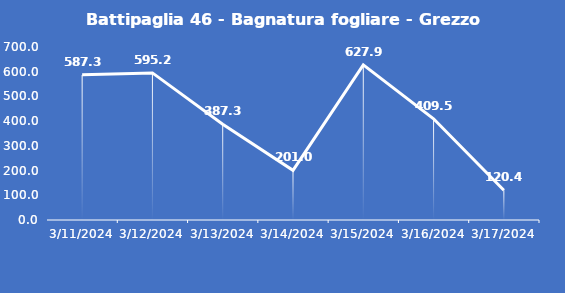
| Category | Battipaglia 46 - Bagnatura fogliare - Grezzo (min) |
|---|---|
| 3/11/24 | 587.3 |
| 3/12/24 | 595.2 |
| 3/13/24 | 387.3 |
| 3/14/24 | 201 |
| 3/15/24 | 627.9 |
| 3/16/24 | 409.5 |
| 3/17/24 | 120.4 |